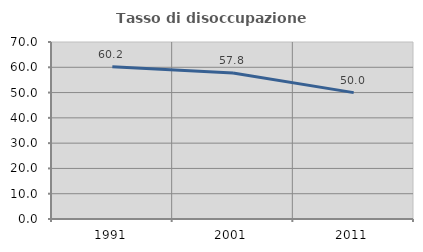
| Category | Tasso di disoccupazione giovanile  |
|---|---|
| 1991.0 | 60.239 |
| 2001.0 | 57.763 |
| 2011.0 | 49.986 |